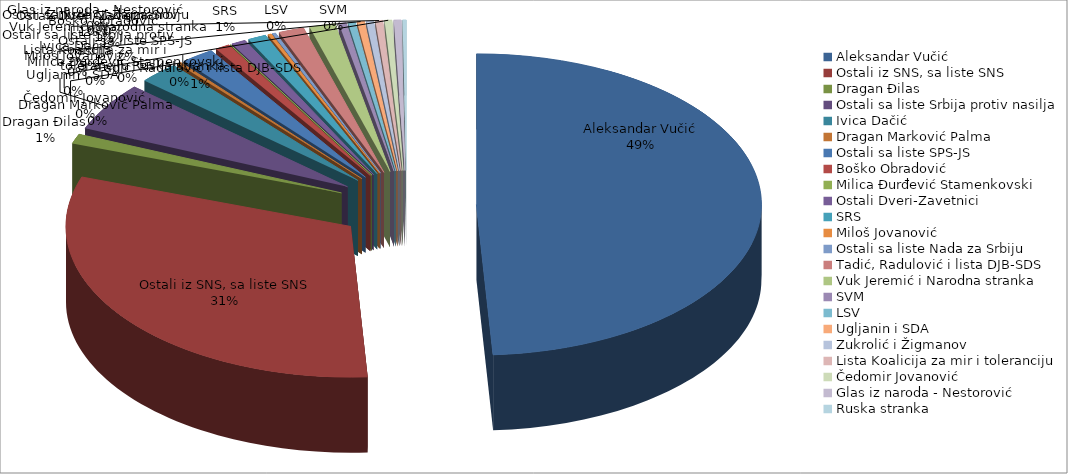
| Category | Series 0 |
|---|---|
| Aleksandar Vučić | 237 |
| Ostali iz SNS, sa liste SNS | 151 |
| Dragan Đilas | 5 |
| Ostali sa liste Srbija protiv nasilja | 25 |
| Ivica Dačić  | 11 |
| Dragan Marković Palma | 1 |
| Ostali sa liste SPS-JS | 9 |
| Boško Obradović | 4 |
| Milica Đurđević Stamenkovski | 0 |
| Ostali Dveri-Zavetnici | 4 |
| SRS | 5 |
| Miloš Jovanović  | 1 |
| Ostali sa liste Nada za Srbiju | 1 |
| Tadić, Radulović i lista DJB-SDS | 7 |
| Vuk Jeremić i Narodna stranka | 7 |
| SVM | 2 |
| LSV | 2 |
| Ugljanin i SDA | 2 |
| Zukrolić i Žigmanov | 2 |
| Lista Koalicija za mir i toleranciju | 2 |
| Čedomir Jovanović | 2 |
| Glas iz naroda - Nestorović | 2 |
| Ruska stranka | 1 |